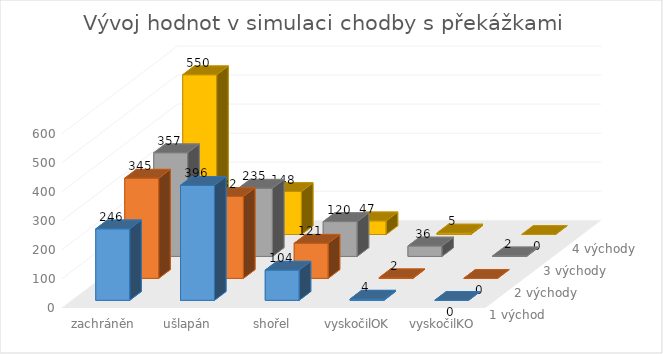
| Category | 1 východ | 2 východy | 3 východy | 4 východy |
|---|---|---|---|---|
| zachráněn | 246 | 345 | 357 | 550 |
| ušlapán | 396 | 282 | 235 | 148 |
| shořel | 104 | 121 | 120 | 47 |
| vyskočilOK | 4 | 2 | 36 | 5 |
| vyskočilKO | 0 | 0 | 2 | 0 |